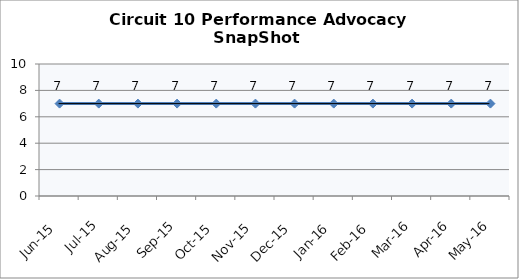
| Category | Circuit 10 |
|---|---|
| Jun-15 | 7 |
| Jul-15 | 7 |
| Aug-15 | 7 |
| Sep-15 | 7 |
| Oct-15 | 7 |
| Nov-15 | 7 |
| Dec-15 | 7 |
| Jan-16 | 7 |
| Feb-16 | 7 |
| Mar-16 | 7 |
| Apr-16 | 7 |
| May-16 | 7 |